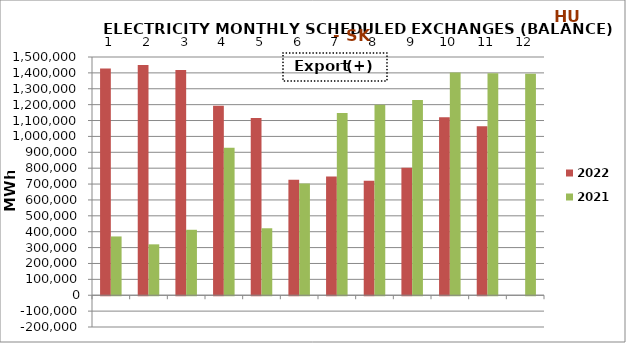
| Category | 2022 | 2021 |
|---|---|---|
| 0 | 1427269.4 | 370127.7 |
| 1 | 1449616.4 | 320439.5 |
| 2 | 1418433.3 | 412141.5 |
| 3 | 1193446.2 | 929019.4 |
| 4 | 1115427.9 | 421635.6 |
| 5 | 726641.6 | 703346.9 |
| 6 | 748162.1 | 1146991.3 |
| 7 | 721148.9 | 1199233.4 |
| 8 | 802188.7 | 1229888.8 |
| 9 | 1119913.9 | 1402498.5 |
| 10 | 1063413.375 | 1397493.7 |
| 11 | 0 | 1395040.8 |